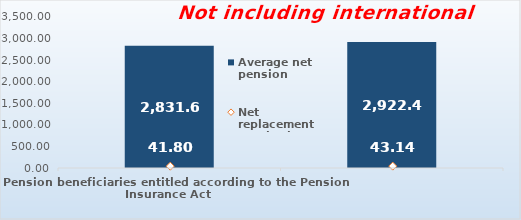
| Category | Average net pension  |
|---|---|
| Pension beneficiaries entitled according to the Pension Insurance Act   | 2831.61 |
| Pension beneficiaries entitled to pension FOR THE FIRST TIME in 2020 according to the Pension Insurance Act  - NEW BENEFICIARIES | 2922.4 |